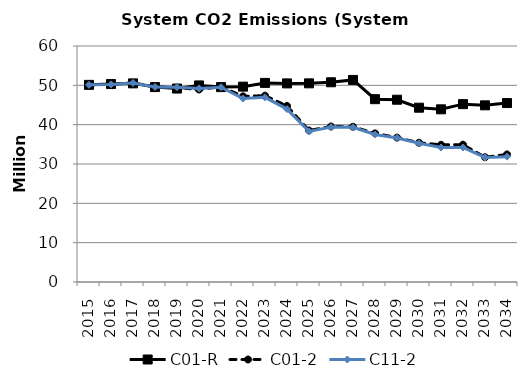
| Category | C01-R | C01-2 | C11-2 |
|---|---|---|---|
| 2015.0 | 50.118 | 50.118 | 50.119 |
| 2016.0 | 50.329 | 50.238 | 50.228 |
| 2017.0 | 50.499 | 50.622 | 50.598 |
| 2018.0 | 49.555 | 49.636 | 49.599 |
| 2019.0 | 49.181 | 49.421 | 49.525 |
| 2020.0 | 49.976 | 48.938 | 49.223 |
| 2021.0 | 49.548 | 49.665 | 49.527 |
| 2022.0 | 49.671 | 47.203 | 46.639 |
| 2023.0 | 50.618 | 47.383 | 46.953 |
| 2024.0 | 50.491 | 44.746 | 43.964 |
| 2025.0 | 50.508 | 38.519 | 38.301 |
| 2026.0 | 50.777 | 39.539 | 39.381 |
| 2027.0 | 51.38 | 39.462 | 39.336 |
| 2028.0 | 46.481 | 37.785 | 37.513 |
| 2029.0 | 46.342 | 36.715 | 36.628 |
| 2030.0 | 44.317 | 35.397 | 35.27 |
| 2031.0 | 43.901 | 34.881 | 34.193 |
| 2032.0 | 45.215 | 34.915 | 34.203 |
| 2033.0 | 44.915 | 31.713 | 31.665 |
| 2034.0 | 45.496 | 32.435 | 31.872 |